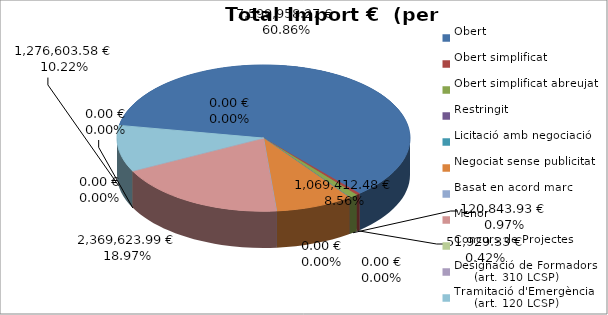
| Category | Total preu
(amb IVA) |
|---|---|
| Obert | 7599958.27 |
| Obert simplificat | 51929.33 |
| Obert simplificat abreujat | 120843.93 |
| Restringit | 0 |
| Licitació amb negociació | 0 |
| Negociat sense publicitat | 1069412.48 |
| Basat en acord marc | 0 |
| Menor | 2369623.99 |
| Concurs de Projectes | 0 |
| Designació de Formadors
     (art. 310 LCSP) | 0 |
| Tramitació d'Emergència
     (art. 120 LCSP) | 1276603.58 |